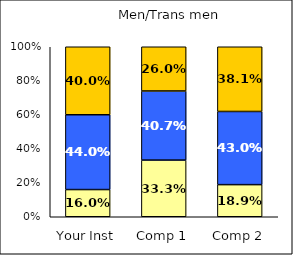
| Category | Low Institutional Priority: Commitment to Diversity | Average Institutional Priority: Commitment to Diversity | High Institutional Priority: Commitment to Diversity |
|---|---|---|---|
| Your Inst | 0.16 | 0.44 | 0.4 |
| Comp 1 | 0.333 | 0.407 | 0.26 |
| Comp 2 | 0.189 | 0.43 | 0.381 |